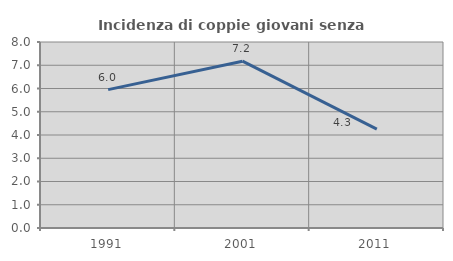
| Category | Incidenza di coppie giovani senza figli |
|---|---|
| 1991.0 | 5.952 |
| 2001.0 | 7.174 |
| 2011.0 | 4.25 |